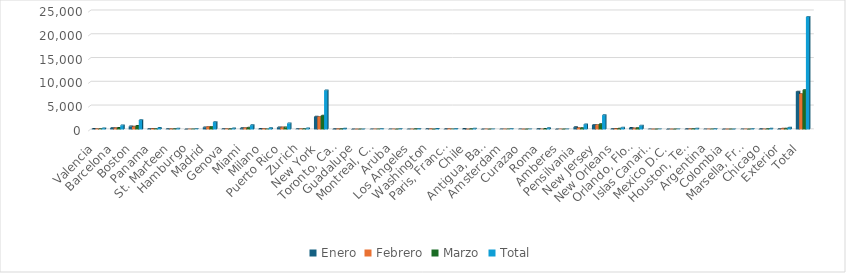
| Category | Enero | Febrero | Marzo | Total |
|---|---|---|---|---|
| Valencia | 93 | 83 | 70 | 246 |
| Barcelona | 297 | 263 | 318 | 878 |
| Boston | 647 | 568 | 742 | 1957 |
| Panama | 126 | 97 | 84 | 307 |
| St. Marteen | 83 | 59 | 40 | 182 |
| Hamburgo | 7 | 27 | 32 | 66 |
| Madrid | 450 | 545 | 543 | 1538 |
| Genova | 70 | 74 | 59 | 203 |
| Miami | 253 | 278 | 363 | 894 |
| Milano | 111 | 142 | 36 | 289 |
| Puerto Rico | 420 | 423 | 438 | 1281 |
| Zurich | 66 | 76 | 83 | 225 |
| New York | 2671 | 2647 | 2896 | 8214 |
| Toronto, Canada | 58 | 52 | 59 | 169 |
| Guadalupe | 0 | 0 | 0 | 0 |
| Montreal, Canada | 26 | 20 | 25 | 71 |
| Aruba | 23 | 21 | 1 | 45 |
| Los Angeles | 34 | 39 | 53 | 126 |
| Washington | 69 | 41 | 7 | 117 |
| Paris, Francia | 43 | 84 | 15 | 142 |
| Chile | 114 | 4 | 64 | 182 |
| Antigua, Barbuda | 3 | 20 | 0 | 23 |
| Amsterdam | 24 | 28 | 18 | 70 |
| Curazao | 13 | 5 | 8 | 26 |
| Roma | 126 | 22 | 106 | 254 |
| Amberes | 3 | 13 | 4 | 20 |
| Pensilvania | 478 | 295 | 286 | 1059 |
| New Jersey | 967 | 917 | 1117 | 3001 |
| New Orleans | 122 | 110 | 167 | 399 |
| Orlando, Florida | 317 | 216 | 293 | 826 |
| Islas Canarias | 13 | 1 | 7 | 21 |
| Mexico D.C. | 8 | 2 | 10 | 20 |
| Houston, Texas | 54 | 42 | 90 | 186 |
| Argentina | 24 | 24 | 35 | 83 |
| Colombia | 0 | 4 | 4 | 8 |
| Marsella, Francia | 22 | 19 | 11 | 52 |
| Chicago | 65 | 35 | 50 | 150 |
| Exterior | 55 | 159 | 153 | 367 |
| Total | 7955 | 7455 | 8287 | 23697 |